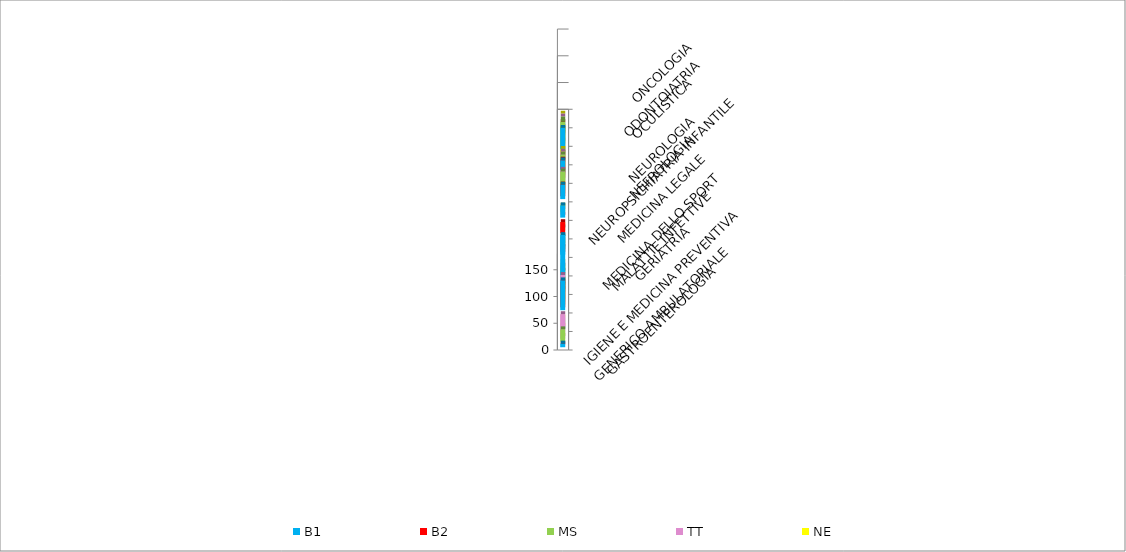
| Category | B1 | B2 | MS | TT | NE |
|---|---|---|---|---|---|
| GASTROENTEROLOGIA | 7 | 0 | 23 | 46 | 0 |
| GENERICO AMBULATORIALE | 0 | 0 | 0 | 0 | 0 |
| GERIATRIA | 56 | 47 | 37 | 50 | 36 |
| IGIENE E MEDICINA PREVENTIVA | 106 | 0 | 38 | 0 | 0 |
| MALATTIE INFETTIVE | 4 | 0 | 0 | 0 | 0 |
| MEDICINA DELLO SPORT | 32 | 9 | 24 | 11 | 0 |
| MEDICINA LEGALE | 0 | 21 | 6 | 0 | 0 |
| NEFROLOGIA | 23 | 0 | 12 | 0 | 0 |
| NEUROLOGIA | 27 | 22 | 41 | 39 | 27 |
| NEUROPSICHIATRIA INFANTILE | 38 | 34 | 38 | 38 | 38 |
| OCULISTICA | 64 | 12 | 47 | 38 | 40 |
| ODONTOIATRIA | 28 | 0 | 30 | 14 | 10 |
| ONCOLOGIA | 0 | 0 | 0 | 0 | 0 |